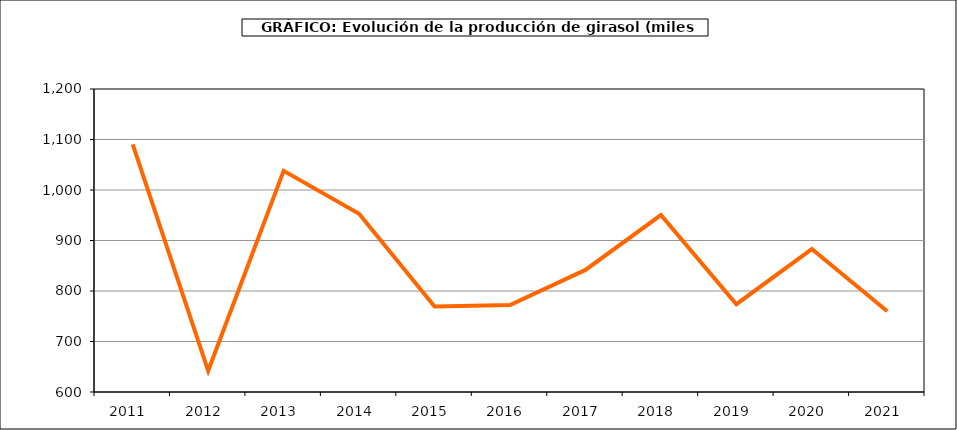
| Category | Producción |
|---|---|
| 2011.0 | 1090.171 |
| 2012.0 | 642.017 |
| 2013.0 | 1038.071 |
| 2014.0 | 952.986 |
| 2015.0 | 769.195 |
| 2016.0 | 772.18 |
| 2017.0 | 841.74 |
| 2018.0 | 950.346 |
| 2019.0 | 773.787 |
| 2020.0 | 883.094 |
| 2021.0 | 759.995 |